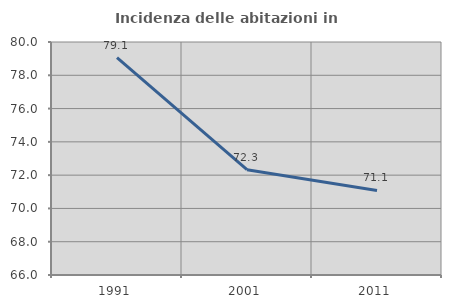
| Category | Incidenza delle abitazioni in proprietà  |
|---|---|
| 1991.0 | 79.067 |
| 2001.0 | 72.33 |
| 2011.0 | 71.078 |